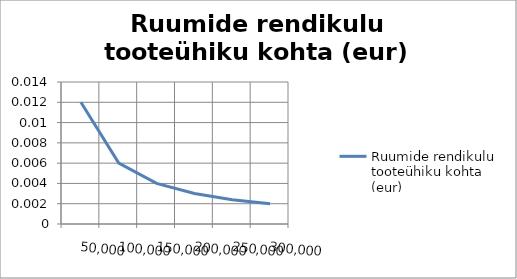
| Category | Ruumide rendikulu tooteühiku kohta (eur) |
|---|---|
| 50000.0 | 0.012 |
| 100000.0 | 0.006 |
| 150000.0 | 0.004 |
| 200000.0 | 0.003 |
| 250000.0 | 0.002 |
| 300000.0 | 0.002 |